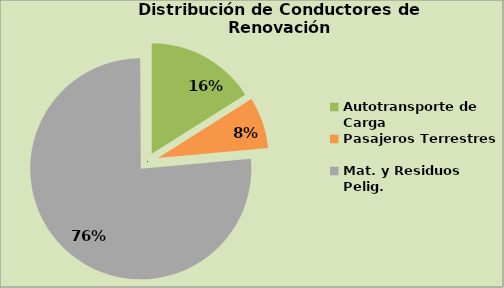
| Category | Series 0 |
|---|---|
| Autotransporte de Carga | 16.028 |
| Pasajeros Terrestres | 7.529 |
| Mat. y Residuos Pelig. | 76.346 |
| Chofer Guía | 0.097 |